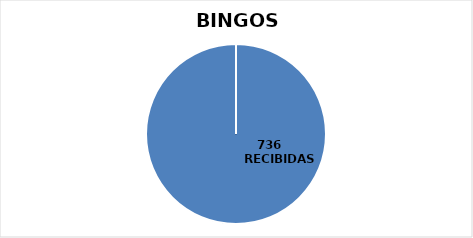
| Category | Series 0 |
|---|---|
| 0 | 736 |
| 1 | 0 |